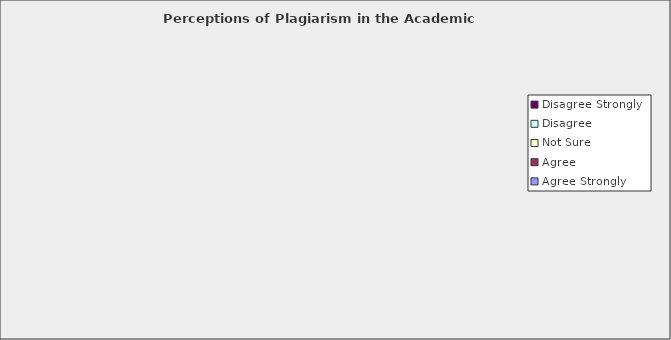
| Category | Agree Strongly | Agree | Not Sure | Disagree | Disagree Strongly |
|---|---|---|---|---|---|
| Plagiarism is a serious problem at UF. | 81 | 156 | 349 | 43 | 8 |
| Investigation of suspected incidents of plagiarism is fair and impartial at UF. | 44 | 146 | 407 | 23 | 12 |
| Faculty members are vigilant in discovering and reporting suspected cases of academic dishonesty, specifically plagiarism. | 39 | 229 | 242 | 105 | 18 |
| Faculty members change assignments on a regular basis. | 34 | 178 | 243 | 154 | 24 |
| The amount of course work I'm expected to complete is reasonable for my year level and program. | 122 | 416 | 49 | 39 | 6 |
| The degree of difficulty in my assignments is appropriate for my year level and program. | 131 | 422 | 53 | 19 | 6 |
| The types of assessment used in my courses are effective at helping me learn course concepts. | 114 | 409 | 64 | 40 | 4 |